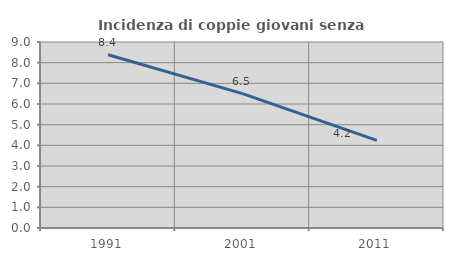
| Category | Incidenza di coppie giovani senza figli |
|---|---|
| 1991.0 | 8.386 |
| 2001.0 | 6.504 |
| 2011.0 | 4.238 |